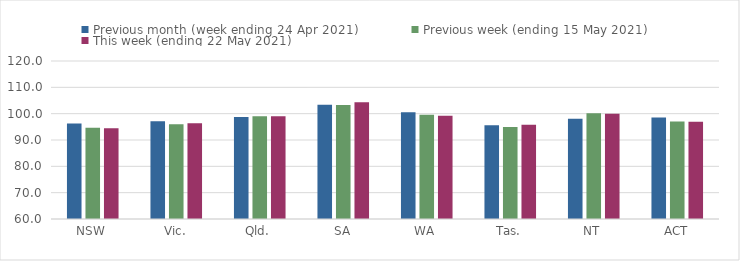
| Category | Previous month (week ending 24 Apr 2021) | Previous week (ending 15 May 2021) | This week (ending 22 May 2021) |
|---|---|---|---|
| NSW | 96.27 | 94.62 | 94.47 |
| Vic. | 97.1 | 95.96 | 96.33 |
| Qld. | 98.72 | 99.01 | 99.06 |
| SA | 103.43 | 103.33 | 104.29 |
| WA | 100.5 | 99.59 | 99.2 |
| Tas. | 95.63 | 94.96 | 95.75 |
| NT | 98.1 | 100.15 | 99.96 |
| ACT | 98.56 | 97.04 | 96.92 |